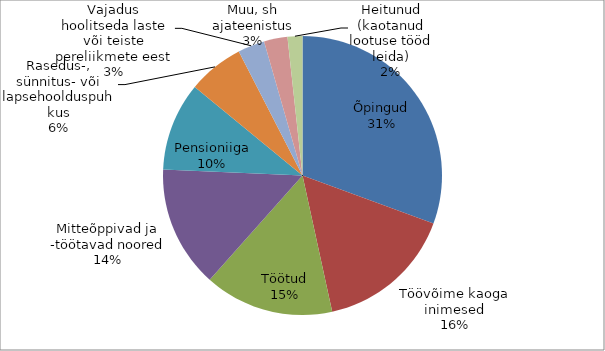
| Category | Arv |
|---|---|
| Õpingud | 85283.533 |
| Töövõime kaoga inimesed | 44528.271 |
| Töötud | 41794.579 |
| Mitteõppivad ja -töötavad noored | 39278.959 |
| Pensioniiga | 28635.606 |
| Rasedus-, sünnitus- või lapsehoolduspuhkus | 18107.78 |
| Vajadus hoolitseda laste või teiste pereliikmete eest | 8649.403 |
| Muu, sh ajateenistus | 7583.677 |
| Heitunud (kaotanud lootuse tööd leida) | 4798.478 |